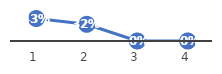
| Category | Series 0 |
|---|---|
| 0 | 0.435 |
| 1 | 0.323 |
| 2 | 0 |
| 3 | 0 |